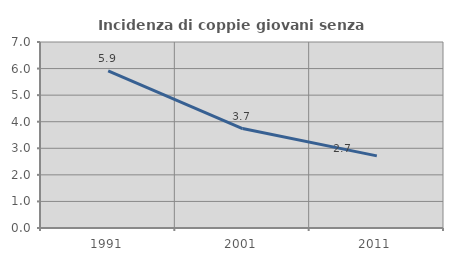
| Category | Incidenza di coppie giovani senza figli |
|---|---|
| 1991.0 | 5.917 |
| 2001.0 | 3.743 |
| 2011.0 | 2.715 |